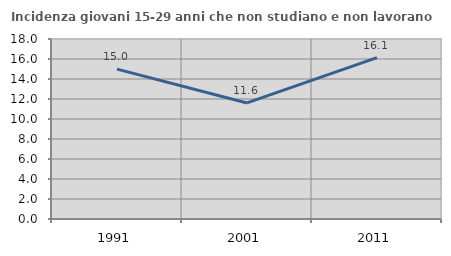
| Category | Incidenza giovani 15-29 anni che non studiano e non lavorano  |
|---|---|
| 1991.0 | 14.991 |
| 2001.0 | 11.607 |
| 2011.0 | 16.135 |